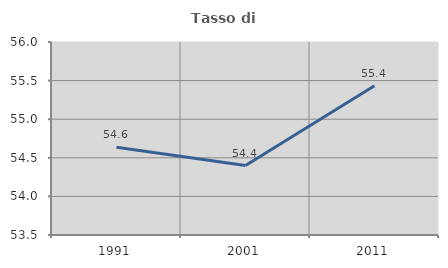
| Category | Tasso di occupazione   |
|---|---|
| 1991.0 | 54.635 |
| 2001.0 | 54.4 |
| 2011.0 | 55.432 |